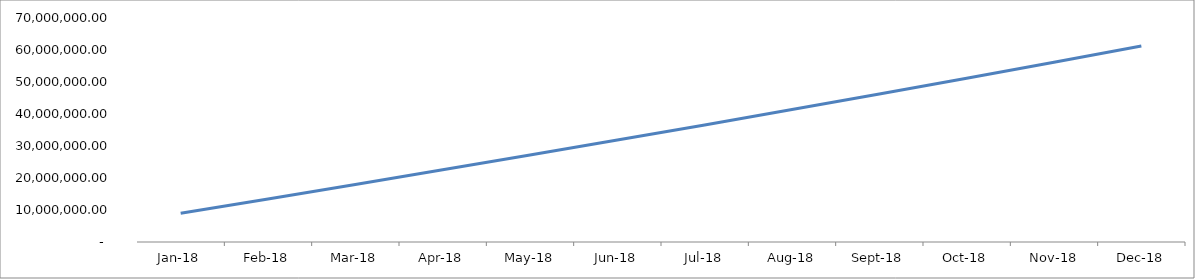
| Category | Series 0 |
|---|---|
| 2018-01-01 | 8999299.746 |
| 2018-02-01 | 13464130.747 |
| 2018-03-01 | 17980307.304 |
| 2018-04-01 | 22548419.892 |
| 2018-05-01 | 27169065.774 |
| 2018-06-01 | 31842849.084 |
| 2018-07-01 | 36587120.902 |
| 2018-08-01 | 41402691.846 |
| 2018-09-01 | 46273641.855 |
| 2018-10-01 | 51200607.79 |
| 2018-11-01 | 56184233.833 |
| 2018-12-01 | 61225171.576 |